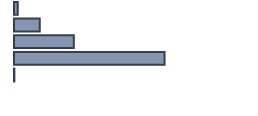
| Category | Percentatge |
|---|---|
| 0 | 1.515 |
| 1 | 10.682 |
| 2 | 24.924 |
| 3 | 62.727 |
| 4 | 0.152 |
| 5 | 0 |